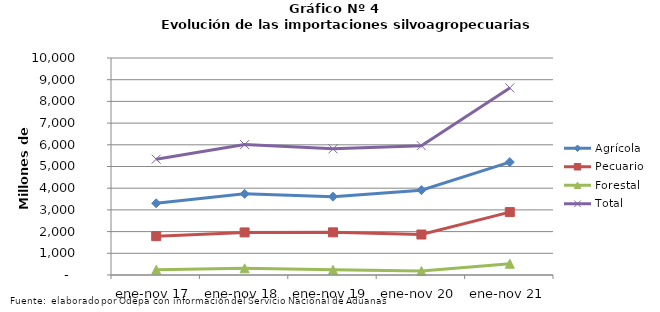
| Category | Agrícola | Pecuario | Forestal | Total |
|---|---|---|---|---|
| ene-nov 17 | 3305225 | 1790364 | 241068 | 5336657 |
| ene-nov 18 | 3740346 | 1961774 | 307528 | 6009648 |
| ene-nov 19 | 3609672 | 1965902 | 239178 | 5814752 |
| ene-nov 20 | 3910395 | 1865252 | 182836 | 5958483 |
| ene-nov 21 | 5202633 | 2899324 | 519987 | 8621944 |